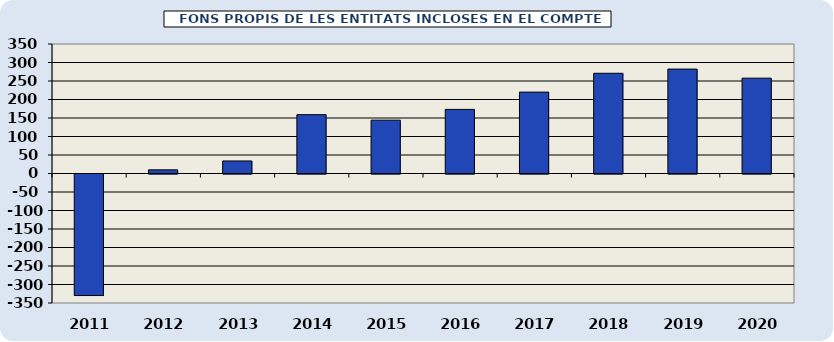
| Category | FONS PROPIS DE LES ENTITATS INCLOSES EN EL COMPTE GENERAL  |
|---|---|
| 2011.0 | -328.48 |
| 2012.0 | 9.89 |
| 2013.0 | 33.89 |
| 2014.0 | 159.03 |
| 2015.0 | 144.16 |
| 2016.0 | 173.24 |
| 2017.0 | 219.98 |
| 2018.0 | 270.9 |
| 2019.0 | 282.19 |
| 2020.0 | 257.67 |